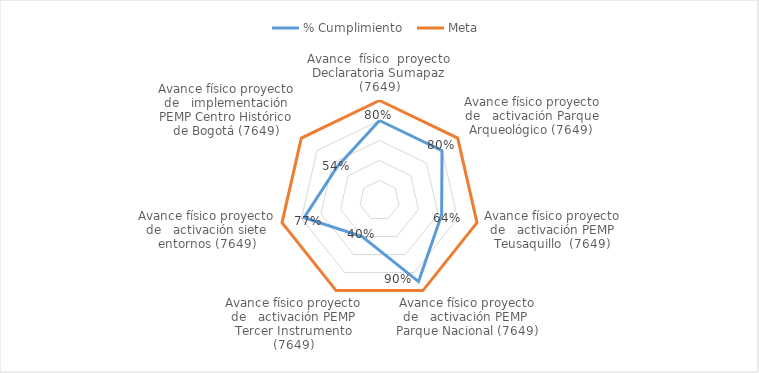
| Category | % Cumplimiento  | Meta  |
|---|---|---|
| Avance  físico  proyecto Declaratoria Sumapaz (7649) | 0.8 | 1 |
| Avance físico proyecto de   activación Parque Arqueológico (7649)  | 0.799 | 1 |
| Avance físico proyecto de   activación PEMP Teusaquillo  (7649) | 0.638 | 1 |
| Avance físico proyecto de   activación PEMP  Parque Nacional (7649) | 0.9 | 1 |
| Avance físico proyecto de   activación PEMP Tercer Instrumento (7649) | 0.4 | 1 |
| Avance físico proyecto de   activación siete entornos (7649) | 0.774 | 1 |
| Avance físico proyecto de   implementación PEMP Centro Histórico de Bogotá (7649) | 0.541 | 1 |